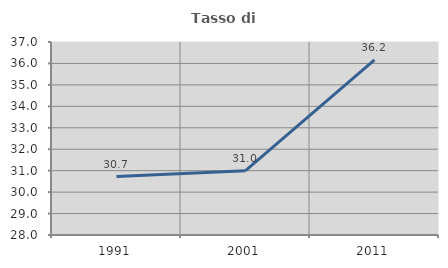
| Category | Tasso di occupazione   |
|---|---|
| 1991.0 | 30.726 |
| 2001.0 | 30.997 |
| 2011.0 | 36.164 |